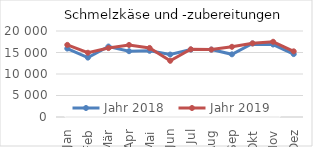
| Category | Jahr 2018 | Jahr 2019 |
|---|---|---|
| Jan | 15919.092 | 16769.871 |
| Feb | 13808.169 | 14944.597 |
| Mär | 16389.095 | 16030.828 |
| Apr | 15303.13 | 16756.818 |
| Mai | 15390.335 | 16058.441 |
| Jun | 14527.373 | 13070.386 |
| Jul | 15679.148 | 15742.71 |
| Aug | 15678.167 | 15677.903 |
| Sep | 14577.495 | 16325.122 |
| Okt | 17102.205 | 17124.785 |
| Nov | 16851.785 | 17495.937 |
| Dez | 14627.477 | 15273.469 |